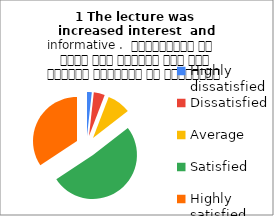
| Category | 1 The lecture was  increased interest  and informative .  व्याख्यान से रुचि में वृद्धि हुई एवं शिक्षण जानकारी से परिपूर्ण था |
|---|---|
| Highly dissatisfied | 3 |
| Dissatisfied | 7 |
| Average | 15 |
| Satisfied | 88 |
| Highly satisfied | 59 |